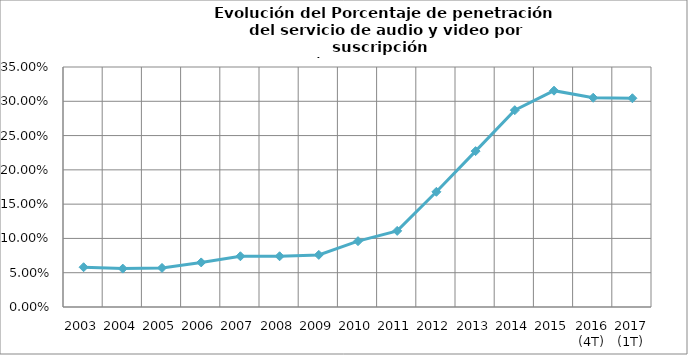
| Category | Grado estimado de penetración del servicio |
|---|---|
| 2003 | 0.058 |
| 2004 | 0.056 |
| 2005 | 0.057 |
| 2006 | 0.065 |
| 2007 | 0.074 |
| 2008 | 0.074 |
| 2009 | 0.076 |
| 2010 | 0.096 |
| 2011 | 0.111 |
| 2012 | 0.168 |
| 2013 | 0.227 |
| 2014 | 0.287 |
| 2015 | 0.315 |
| 2016 (4T) | 0.305 |
| 2017 (1T) | 0.304 |